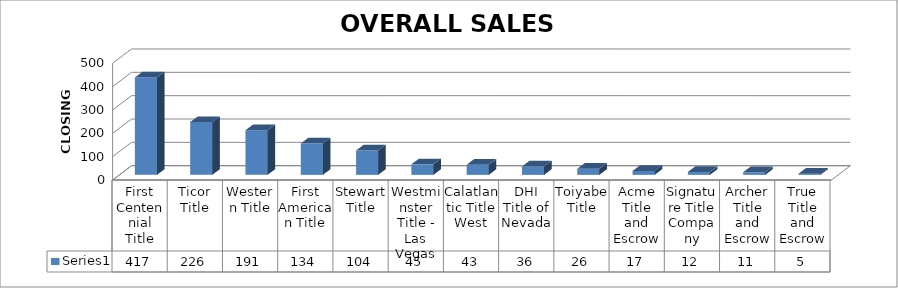
| Category | Series 0 |
|---|---|
| First Centennial Title | 417 |
| Ticor Title | 226 |
| Western Title | 191 |
| First American Title | 134 |
| Stewart Title | 104 |
| Westminster Title - Las Vegas | 45 |
| Calatlantic Title West | 43 |
| DHI Title of Nevada | 36 |
| Toiyabe Title | 26 |
| Acme Title and Escrow | 17 |
| Signature Title Company | 12 |
| Archer Title and Escrow | 11 |
| True Title and Escrow | 5 |